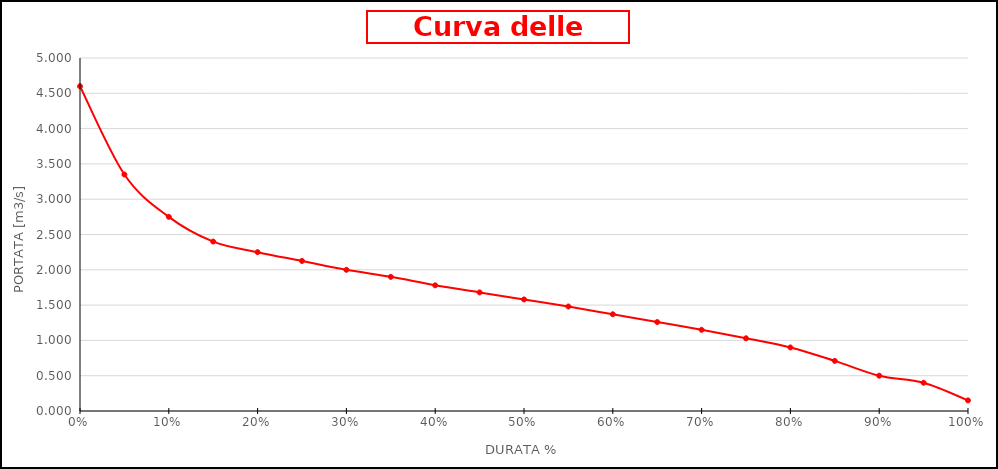
| Category | PORTATA [m3/s] |
|---|---|
| 0.0 | 4.6 |
| 0.05 | 3.35 |
| 0.1 | 2.75 |
| 0.15 | 2.4 |
| 0.2 | 2.25 |
| 0.25 | 2.125 |
| 0.3 | 2 |
| 0.35 | 1.9 |
| 0.4 | 1.78 |
| 0.45 | 1.68 |
| 0.5 | 1.58 |
| 0.55 | 1.48 |
| 0.6 | 1.37 |
| 0.65 | 1.26 |
| 0.7 | 1.15 |
| 0.75 | 1.03 |
| 0.8 | 0.9 |
| 0.85 | 0.71 |
| 0.9 | 0.5 |
| 0.95 | 0.4 |
| 1.0 | 0.15 |